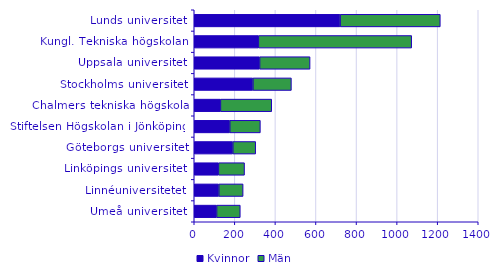
| Category | Kvinnor | Män |
|---|---|---|
| Umeå universitet | 110 | 117 |
| Linnéuniversitetet | 121 | 120 |
| Linköpings universitet | 119 | 129 |
| Göteborgs universitet | 190 | 113 |
| Stiftelsen Högskolan i Jönköping | 175 | 151 |
| Chalmers tekniska högskola | 129 | 253 |
| Stockholms universitet | 289 | 190 |
| Uppsala universitet | 322 | 249 |
| Kungl. Tekniska högskolan | 316 | 756 |
| Lunds universitet | 719 | 494 |